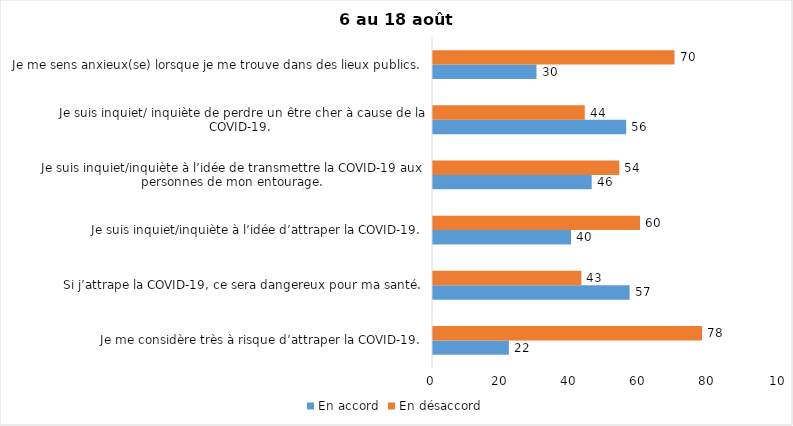
| Category | En accord | En désaccord |
|---|---|---|
| Je me considère très à risque d’attraper la COVID-19. | 22 | 78 |
| Si j’attrape la COVID-19, ce sera dangereux pour ma santé. | 57 | 43 |
| Je suis inquiet/inquiète à l’idée d’attraper la COVID-19. | 40 | 60 |
| Je suis inquiet/inquiète à l’idée de transmettre la COVID-19 aux personnes de mon entourage. | 46 | 54 |
| Je suis inquiet/ inquiète de perdre un être cher à cause de la COVID-19. | 56 | 44 |
| Je me sens anxieux(se) lorsque je me trouve dans des lieux publics. | 30 | 70 |